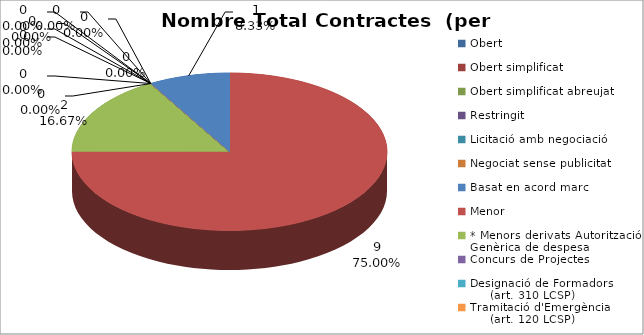
| Category | Nombre Total Contractes |
|---|---|
| Obert | 0 |
| Obert simplificat | 0 |
| Obert simplificat abreujat | 0 |
| Restringit | 0 |
| Licitació amb negociació | 0 |
| Negociat sense publicitat | 0 |
| Basat en acord marc | 1 |
| Menor | 9 |
| * Menors derivats Autorització Genèrica de despesa | 2 |
| Concurs de Projectes | 0 |
| Designació de Formadors
     (art. 310 LCSP) | 0 |
| Tramitació d'Emergència
     (art. 120 LCSP) | 0 |